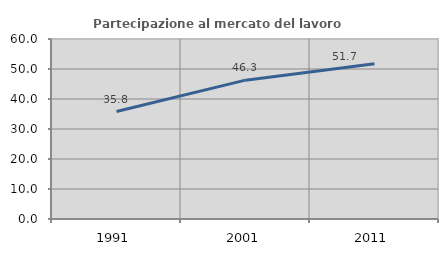
| Category | Partecipazione al mercato del lavoro  femminile |
|---|---|
| 1991.0 | 35.81 |
| 2001.0 | 46.286 |
| 2011.0 | 51.733 |